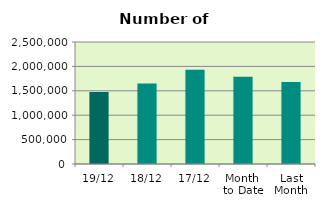
| Category | Series 0 |
|---|---|
| 19/12 | 1473658 |
| 18/12 | 1651184 |
| 17/12 | 1930302 |
| Month 
to Date | 1789176 |
| Last
Month | 1681386.857 |